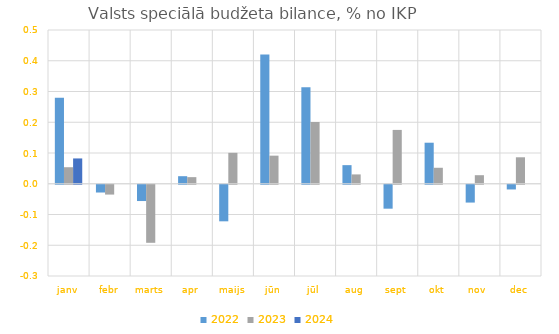
| Category | 2022 | 2023 | 2024 |
|---|---|---|---|
| janv | 0.279 | 0.054 | 0.082 |
| febr | -0.025 | -0.032 | 0 |
| marts | -0.053 | -0.189 | 0 |
| apr | 0.025 | 0.021 | 0 |
| maijs | -0.119 | 0.101 | 0 |
| jūn | 0.421 | 0.091 | 0 |
| jūl | 0.314 | 0.201 | 0 |
| aug | 0.06 | 0.03 | 0 |
| sept | -0.078 | 0.175 | 0 |
| okt | 0.133 | 0.052 | 0 |
| nov | -0.058 | 0.028 | 0 |
| dec | -0.015 | 0.086 | 0 |